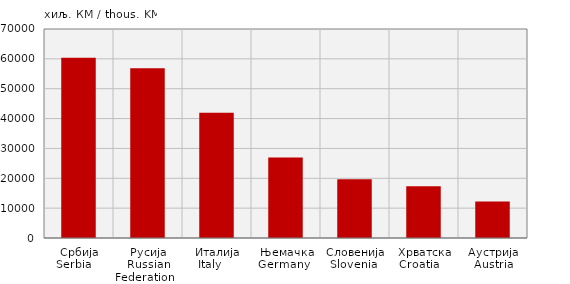
| Category | Увоз
Import |
|---|---|
| Србија
Serbia    | 60338 |
| Русија
Russian Federation   | 56887 |
| Италија
Italy     | 41985 |
| Њемачка
Germany   | 27001 |
| Словенија
Slovenia  | 19646 |
| Хрватска
Croatia    | 17364 |
| Аустрија
Austria | 12244 |